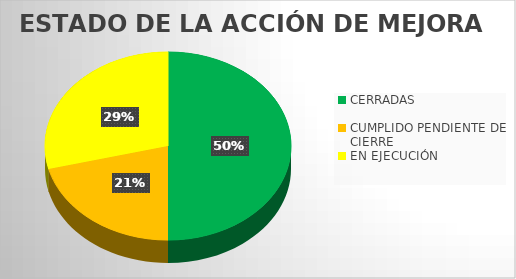
| Category | Series 0 |
|---|---|
| CERRADAS  | 38 |
| CUMPLIDO PENDIENTE DE CIERRE | 16 |
| EN EJECUCIÓN | 22 |